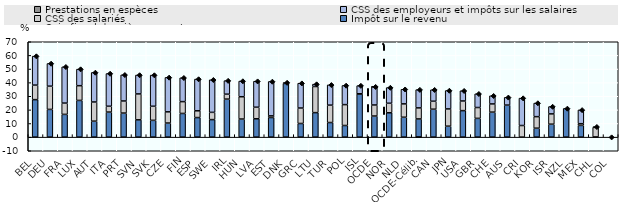
| Category | Impôt sur le revenu | CSS des salariés | CSS des employeurs et impôts sur les salaires | Prestations en espèces |
|---|---|---|---|---|
| BEL | 27.518 | 10.664 | 21.289 | 0 |
| DEU | 20.346 | 17.051 | 16.662 | 0 |
| FRA | 16.686 | 8.298 | 26.63 | 0 |
| LUX | 26.939 | 10.816 | 12.157 | 0 |
| AUT | 11.717 | 14.082 | 21.666 | 0 |
| ITA | 18.392 | 4.289 | 24.001 | 0 |
| PRT | 17.647 | 8.889 | 19.192 | 0 |
| SVN | 12.684 | 19.035 | 13.867 | 0 |
| SVK | 12.319 | 10.332 | 22.899 | 0 |
| CZE | 10.34 | 8.221 | 25.262 | 0 |
| FIN | 17.375 | 8.681 | 17.492 | 0 |
| ESP | 14.366 | 4.946 | 23.313 | 0 |
| SWE | 12.863 | 5.323 | 23.908 | 0 |
| IRL | 27.913 | 3.602 | 9.95 | 0 |
| HUN | 13.274 | 16.372 | 11.504 | 0 |
| LVA | 13.461 | 8.494 | 19.103 | 0 |
| EST | 14.39 | 1.196 | 25.262 | 0 |
| DNK | 39.394 | 0 | 0.611 | 0 |
| GRC | 10.021 | 11.342 | 18.227 | 0 |
| LTU | 17.992 | 19.157 | 1.759 | 0 |
| TUR | 10.72 | 12.766 | 14.894 | 0 |
| POL | 8.538 | 15.32 | 14.06 | 0 |
| ISL | 31.717 | 0.117 | 5.971 | 0 |
| OCDE | 15.489 | 8.11 | 13.388 | 0.012 |
| NOR | 17.873 | 6.991 | 11.504 | 0 |
| NLD | 14.605 | 9.808 | 10.729 | 0 |
| OCDE-Célib. | 13.345 | 8.119 | 13.388 | -0.006 |
| CAN | 20.494 | 5.849 | 8.445 | 0 |
| JPN | 8.028 | 12.672 | 13.502 | 0 |
| USA | 19.453 | 7.075 | 7.517 | 0 |
| GBR | 13.765 | 7.977 | 10.067 | 0 |
| CHE | 18.344 | 6.015 | 6.015 | 0 |
| AUS | 23.51 | 0 | 5.68 | 0 |
| CRI | 0 | 8.524 | 20.109 | 0 |
| KOR | 6.569 | 8.462 | 9.974 | 0 |
| ISR | 9.503 | 7.556 | 5.381 | 0 |
| NZL | 21.053 | 0 | 0 | 0 |
| MEX | 8.606 | 1.247 | 10.128 | 0 |
| CHL | 0.149 | 7 | 0 | 0.449 |
| COL | 0 | 0 | 0 | 0 |